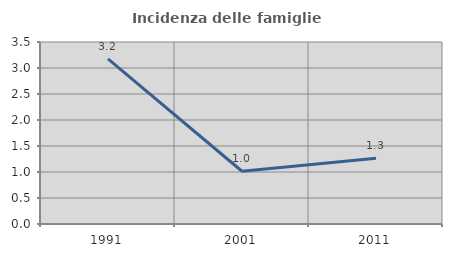
| Category | Incidenza delle famiglie numerose |
|---|---|
| 1991.0 | 3.175 |
| 2001.0 | 1.015 |
| 2011.0 | 1.263 |